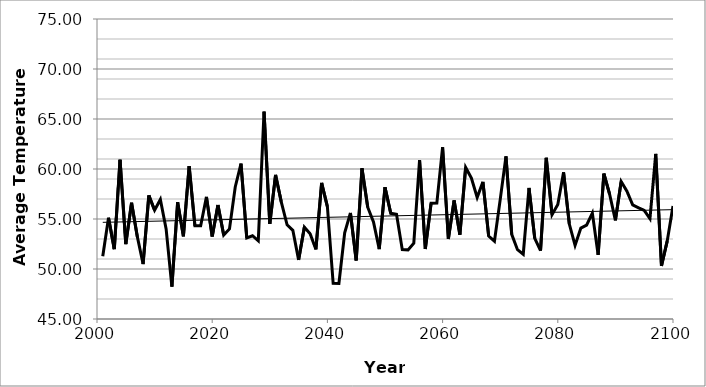
| Category | Committed |
|---|---|
| 2001.0 | 51.267 |
| 2002.0 | 55.132 |
| 2003.0 | 51.989 |
| 2004.0 | 60.926 |
| 2005.0 | 52.489 |
| 2006.0 | 56.62 |
| 2007.0 | 53.233 |
| 2008.0 | 50.499 |
| 2009.0 | 57.36 |
| 2010.0 | 55.873 |
| 2011.0 | 56.948 |
| 2012.0 | 54.014 |
| 2013.0 | 48.232 |
| 2014.0 | 56.682 |
| 2015.0 | 53.263 |
| 2016.0 | 60.283 |
| 2017.0 | 54.318 |
| 2018.0 | 54.315 |
| 2019.0 | 57.211 |
| 2020.0 | 53.256 |
| 2021.0 | 56.401 |
| 2022.0 | 53.388 |
| 2023.0 | 54.007 |
| 2024.0 | 58.204 |
| 2025.0 | 60.534 |
| 2026.0 | 53.112 |
| 2027.0 | 53.326 |
| 2028.0 | 52.812 |
| 2029.0 | 65.739 |
| 2030.0 | 54.511 |
| 2031.0 | 59.407 |
| 2032.0 | 56.696 |
| 2033.0 | 54.421 |
| 2034.0 | 53.866 |
| 2035.0 | 50.913 |
| 2036.0 | 54.183 |
| 2037.0 | 53.524 |
| 2038.0 | 51.962 |
| 2039.0 | 58.604 |
| 2040.0 | 56.228 |
| 2041.0 | 48.574 |
| 2042.0 | 48.546 |
| 2043.0 | 53.609 |
| 2044.0 | 55.605 |
| 2045.0 | 50.855 |
| 2046.0 | 60.069 |
| 2047.0 | 56.181 |
| 2048.0 | 54.707 |
| 2049.0 | 51.987 |
| 2050.0 | 58.177 |
| 2051.0 | 55.566 |
| 2052.0 | 55.468 |
| 2053.0 | 51.935 |
| 2054.0 | 51.913 |
| 2055.0 | 52.579 |
| 2056.0 | 60.883 |
| 2057.0 | 52.002 |
| 2058.0 | 56.568 |
| 2059.0 | 56.59 |
| 2060.0 | 62.175 |
| 2061.0 | 53.002 |
| 2062.0 | 56.86 |
| 2063.0 | 53.436 |
| 2064.0 | 60.154 |
| 2065.0 | 59.085 |
| 2066.0 | 57.15 |
| 2067.0 | 58.714 |
| 2068.0 | 53.287 |
| 2069.0 | 52.781 |
| 2070.0 | 56.937 |
| 2071.0 | 61.259 |
| 2072.0 | 53.465 |
| 2073.0 | 51.93 |
| 2074.0 | 51.476 |
| 2075.0 | 58.104 |
| 2076.0 | 53.055 |
| 2077.0 | 51.832 |
| 2078.0 | 61.122 |
| 2079.0 | 55.431 |
| 2080.0 | 56.457 |
| 2081.0 | 59.67 |
| 2082.0 | 54.496 |
| 2083.0 | 52.36 |
| 2084.0 | 54.091 |
| 2085.0 | 54.385 |
| 2086.0 | 55.587 |
| 2087.0 | 51.422 |
| 2088.0 | 59.544 |
| 2089.0 | 57.475 |
| 2090.0 | 54.864 |
| 2091.0 | 58.744 |
| 2092.0 | 57.78 |
| 2093.0 | 56.408 |
| 2094.0 | 56.122 |
| 2095.0 | 55.864 |
| 2096.0 | 55.031 |
| 2097.0 | 61.507 |
| 2098.0 | 50.306 |
| 2099.0 | 52.804 |
| 2100.0 | 56.311 |